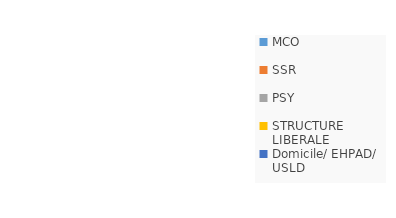
| Category | Series 0 | Series 1 |
|---|---|---|
| MCO |  | 0 |
| SSR |  | 0 |
| PSY  |  | 0 |
| STRUCTURE LIBERALE |  | 0 |
| Domicile/ EHPAD/ USLD |  | 0 |